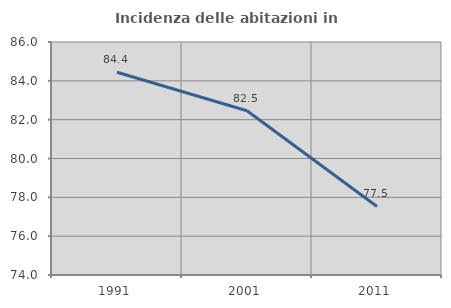
| Category | Incidenza delle abitazioni in proprietà  |
|---|---|
| 1991.0 | 84.444 |
| 2001.0 | 82.459 |
| 2011.0 | 77.529 |